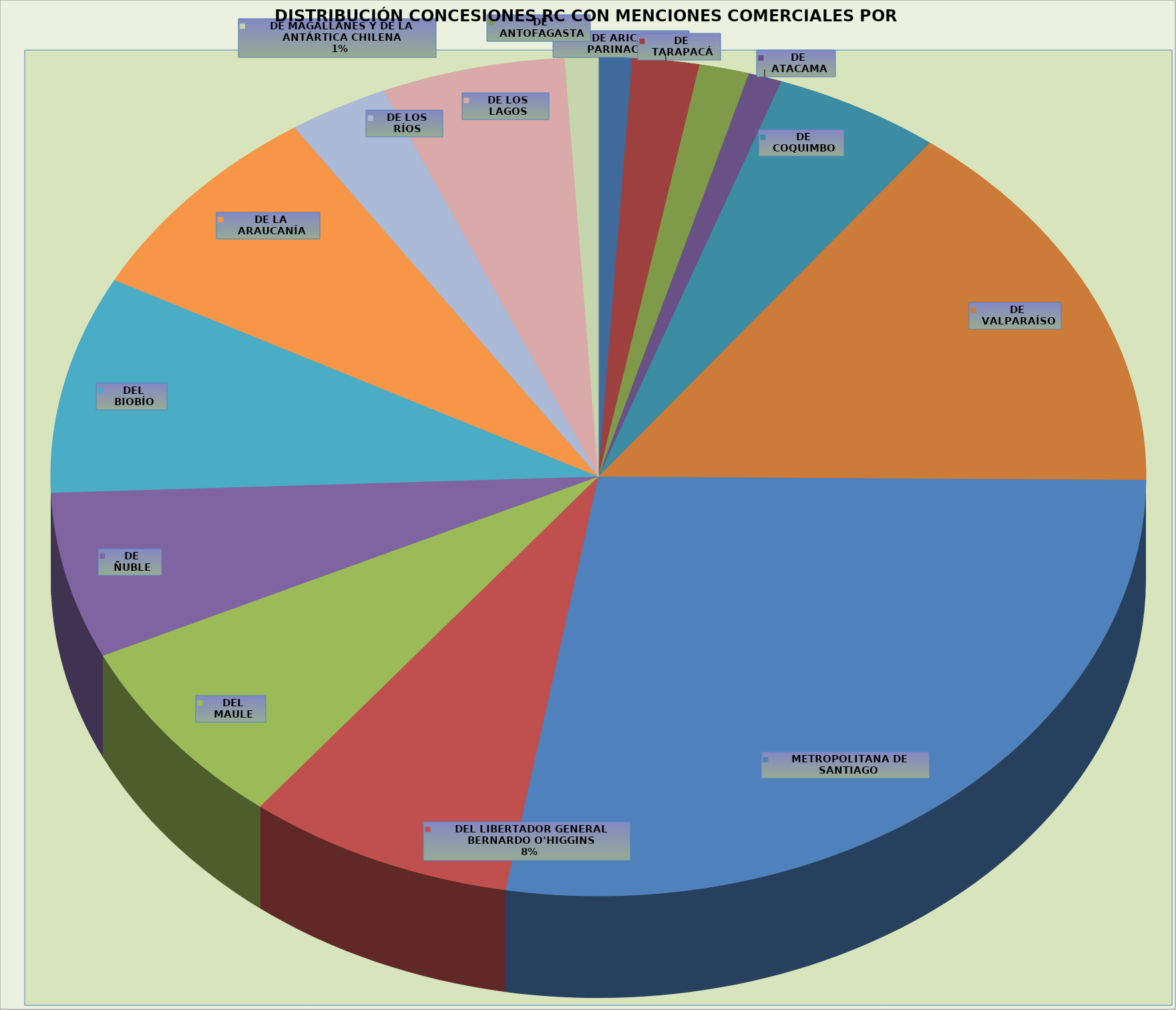
| Category | Total |
|---|---|
| DE ARICA Y PARINACOTA | 2 |
| DE TARAPACÁ | 4 |
| DE ANTOFAGASTA | 3 |
| DE ATACAMA | 2 |
| DE COQUIMBO | 10 |
| DE VALPARAÍSO | 30 |
| METROPOLITANA DE SANTIAGO | 56 |
| DEL LIBERTADOR GENERAL BERNARDO O'HIGGINS | 16 |
| DEL MAULE | 15 |
| DE ÑUBLE | 13 |
| DEL BIOBÍO | 17 |
| DE LA ARAUCANÍA | 16 |
| DE LOS RÍOS | 6 |
| DE LOS LAGOS | 11 |
| DE MAGALLANES Y DE LA ANTÁRTICA CHILENA | 2 |